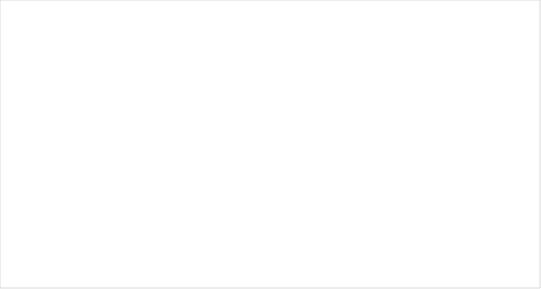
| Category | Average of  
Implied Return | Average of Alpha |
|---|---|---|
| Medium Market Cap | 0.028 | 0.005 |
| Bottom Market Cap | -0.009 | -0.03 |
| Top Market Cap | 0.031 | 0.01 |